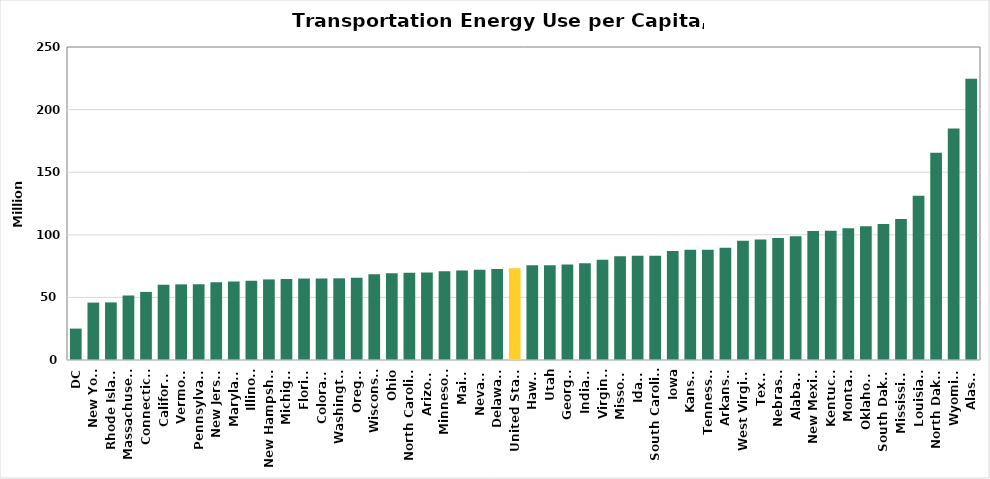
| Category | Million Btu/capita |
|---|---|
| DC | 25.073 |
| New York | 45.841 |
| Rhode Island | 46.002 |
| Massachusetts | 51.527 |
| Connecticut | 54.388 |
| California | 60.031 |
| Vermont | 60.412 |
| Pennsylvania | 60.506 |
| New Jersey | 62.134 |
| Maryland | 62.724 |
| Illinois | 63.339 |
| New Hampshire | 64.363 |
| Michigan | 64.622 |
| Florida | 65.07 |
| Colorado | 65.089 |
| Washington | 65.231 |
| Oregon | 65.707 |
| Wisconsin | 68.539 |
| Ohio | 69.227 |
| North Carolina | 69.774 |
| Arizona | 69.802 |
| Minnesota | 70.908 |
| Maine | 71.416 |
| Nevada | 72.01 |
| Delaware | 72.654 |
| United States | 73.364 |
| Hawaii | 75.613 |
| Utah | 75.705 |
| Georgia | 76.272 |
| Indiana | 77.256 |
| Virginia | 80.141 |
| Missouri | 82.909 |
| Idaho | 83.223 |
| South Carolina | 83.341 |
| Iowa | 86.969 |
| Kansas | 88.019 |
| Tennessee | 88.126 |
| Arkansas | 89.593 |
| West Virginia | 95.347 |
| Texas | 96.187 |
| Nebraska | 97.368 |
| Alabama | 98.772 |
| New Mexico | 103.125 |
| Kentucky | 103.185 |
| Montana | 105.228 |
| Oklahoma | 106.907 |
| South Dakota | 108.558 |
| Mississippi | 112.612 |
| Louisiana | 131.162 |
| North Dakota | 165.559 |
| Wyoming | 184.864 |
| Alaska | 224.657 |